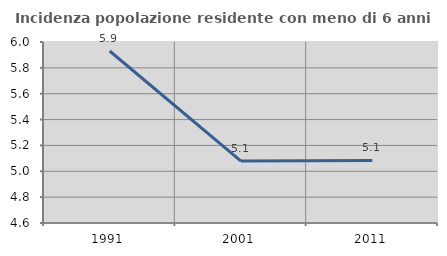
| Category | Incidenza popolazione residente con meno di 6 anni |
|---|---|
| 1991.0 | 5.93 |
| 2001.0 | 5.079 |
| 2011.0 | 5.084 |